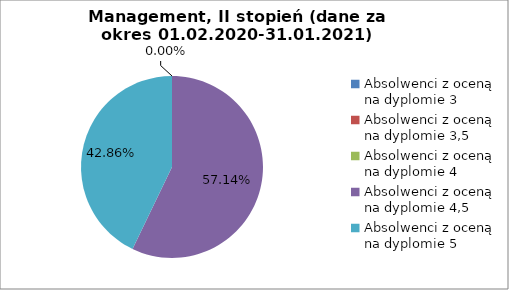
| Category | Series 0 |
|---|---|
| Absolwenci z oceną na dyplomie 3 | 0 |
| Absolwenci z oceną na dyplomie 3,5 | 0 |
| Absolwenci z oceną na dyplomie 4 | 0 |
| Absolwenci z oceną na dyplomie 4,5 | 57.143 |
| Absolwenci z oceną na dyplomie 5 | 42.857 |